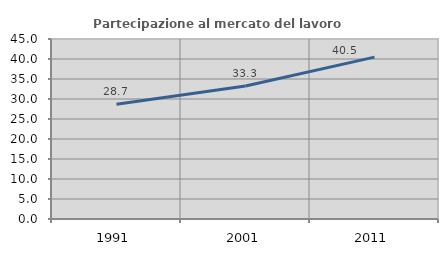
| Category | Partecipazione al mercato del lavoro  femminile |
|---|---|
| 1991.0 | 28.702 |
| 2001.0 | 33.272 |
| 2011.0 | 40.474 |